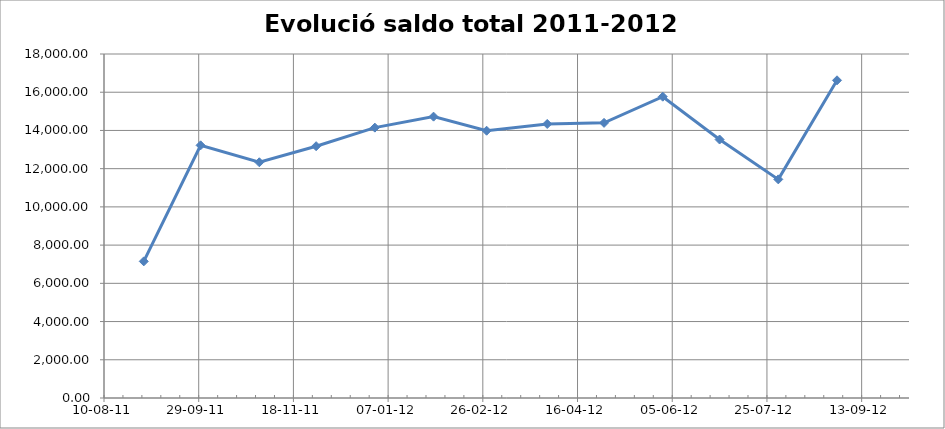
| Category | total € |
|---|---|
| 40786.0 | 7149.72 |
| 40816.0 | 13220.55 |
| 40847.0 | 12334.61 |
| 40877.0 | 13175.63 |
| 40908.0 | 14146.76 |
| 40939.0 | 14722.02 |
| 40967.0 | 13985.51 |
| 40999.0 | 14338.84 |
| 41029.0 | 14396.73 |
| 41060.0 | 15766.28 |
| 41090.0 | 13525.07 |
| 41121.0 | 11439.99 |
| 41152.0 | 16623.91 |